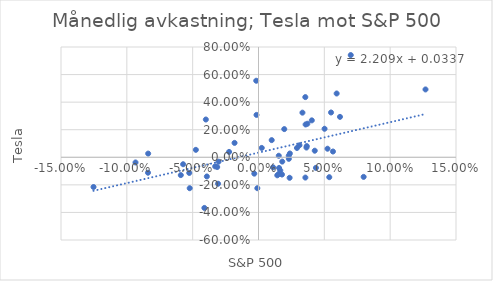
| Category | Series 0 |
|---|---|
| -0.03033909240805804 | -0.032 |
| -0.000883496724777785 | -0.224 |
| -0.01818134728445257 | 0.104 |
| 0.01803567189095679 | -0.031 |
| 0.01956697970379314 | 0.204 |
| 0.014264708551926939 | -0.131 |
| 0.022973611488953584 | 0.012 |
| 0.015284377602508148 | -0.122 |
| -0.03999310701361364 | 0.274 |
| -0.02234101369253194 | 0.039 |
| -0.057255538459843665 | -0.05 |
| 0.01561167136029538 | -0.077 |
| 0.05655847418299536 | 0.042 |
| 0.01783030716624434 | -0.125 |
| 0.03559939799855925 | -0.147 |
| -0.052248777464012755 | -0.224 |
| 0.05017659370367146 | 0.207 |
| 0.03665528325323426 | 0.081 |
| -0.03291267677087961 | -0.066 |
| 0.029218291630716084 | 0.068 |
| -0.0015022668133165284 | 0.307 |
| 0.042724537223610415 | 0.048 |
| 0.0404779542014235 | 0.268 |
| -0.001714862346699343 | 0.555 |
| -0.0837912087912088 | 0.027 |
| -0.12529401213614405 | -0.216 |
| 0.12684410293315368 | 0.492 |
| 0.002465295303234856 | 0.068 |
| 0.06188497778812918 | 0.293 |
| 0.05510129697544421 | 0.325 |
| 0.07006468732421925 | 0.741 |
| -0.039227954095494386 | -0.139 |
| 0.016562592922985377 | -0.095 |
| 0.05935882060432337 | 0.463 |
| 0.03712140665943237 | 0.243 |
| 0.010031761921369899 | 0.125 |
| 0.023638879736408522 | -0.149 |
| 0.0230363364345437 | -0.011 |
| 0.05242531255584731 | 0.062 |
| -0.0031857111765366416 | -0.119 |
| 0.031107165564979455 | 0.087 |
| 0.015406631762652714 | 0.011 |
| 0.0364300102435772 | 0.071 |
| -0.04756914042116628 | 0.054 |
| 0.03555857867831757 | 0.437 |
| 0.023828045311172427 | 0.028 |
| 0.0436128749726298 | -0.077 |
| -0.05258508910699976 | -0.114 |
| -0.03136052086678269 | -0.071 |
| 0.03577323877327999 | 0.238 |
| -0.030705830156652417 | -0.192 |
| -0.05901441486575741 | -0.129 |
| -0.08391999322386641 | -0.112 |
| 0.0333784190754957 | 0.324 |
| 0.011061601899926627 | -0.072 |
| -0.09339570164348929 | -0.038 |
| 0.0798634545768933 | -0.142 |
| 0.05375286029369989 | -0.144 |
| -0.04110918578175589 | -0.367 |